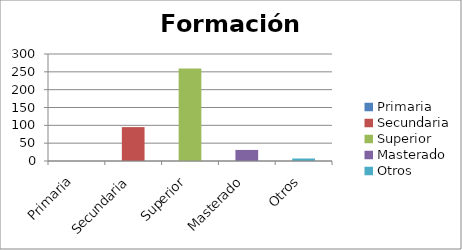
| Category | Formación Académica |
|---|---|
| Primaria | 0 |
| Secundaria | 95 |
| Superior | 259 |
| Masterado | 31 |
| Otros | 7 |